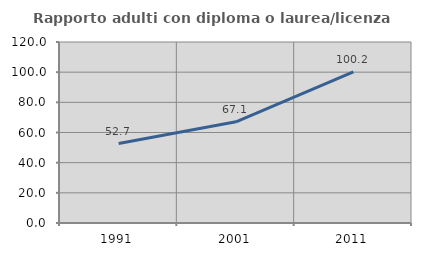
| Category | Rapporto adulti con diploma o laurea/licenza media  |
|---|---|
| 1991.0 | 52.692 |
| 2001.0 | 67.082 |
| 2011.0 | 100.212 |